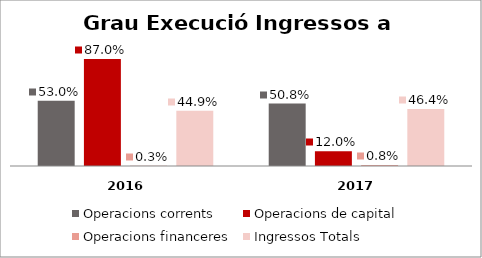
| Category | Operacions corrents | Operacions de capital | Operacions financeres | Ingressos Totals |
|---|---|---|---|---|
| 0 | 0.53 | 0.87 | 0.003 | 0.449 |
| 1 | 0.508 | 0.12 | 0.008 | 0.464 |